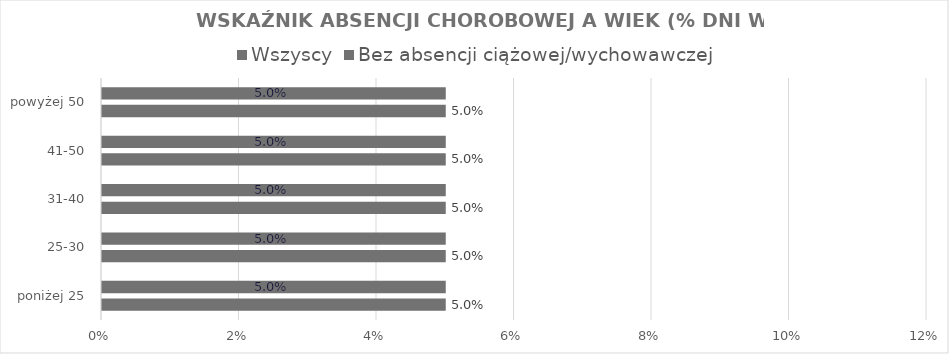
| Category | Wszyscy | Bez absencji ciążowej/wychowawczej |
|---|---|---|
| poniżej 25 | 0.05 | 0.05 |
| 25-30 | 0.05 | 0.05 |
| 31-40 | 0.05 | 0.05 |
| 41-50 | 0.05 | 0.05 |
| powyżej 50 | 0.05 | 0.05 |